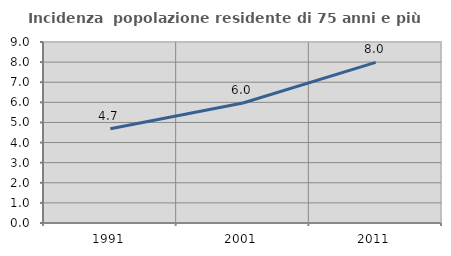
| Category | Incidenza  popolazione residente di 75 anni e più |
|---|---|
| 1991.0 | 4.685 |
| 2001.0 | 5.969 |
| 2011.0 | 7.99 |